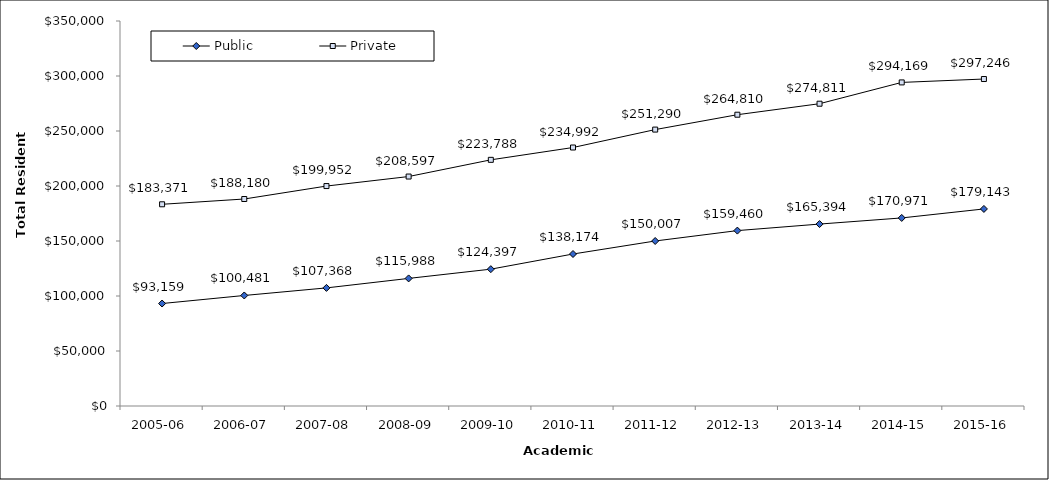
| Category | Public | Private |
|---|---|---|
| 2005-06 | 93159 | 183371 |
| 2006-07 | 100481 | 188180 |
| 2007-08 | 107368 | 199952 |
| 2008-09 | 115988 | 208597 |
| 2009-10 | 124397 | 223788 |
| 2010-11 | 138174 | 234992 |
| 2011-12 | 150007 | 251290 |
| 2012-13 | 159460 | 264810 |
| 2013-14 | 165394 | 274811 |
| 2014-15 | 170971 | 294169 |
| 2015-16 | 179142.68 | 297246.04 |